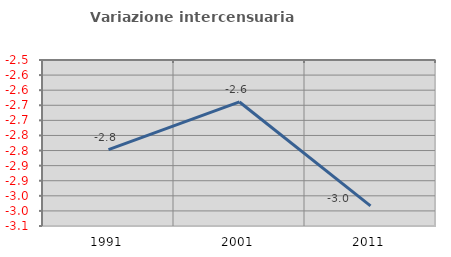
| Category | Variazione intercensuaria annua |
|---|---|
| 1991.0 | -2.797 |
| 2001.0 | -2.639 |
| 2011.0 | -2.984 |